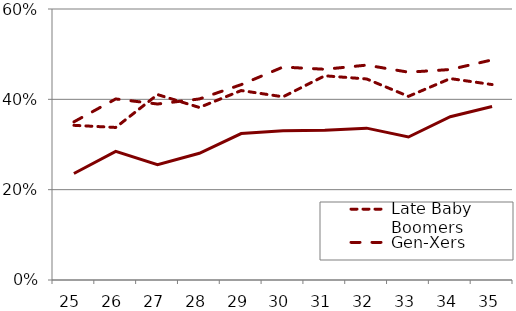
| Category | Late Baby Boomers | Gen-Xers | Millennials |
|---|---|---|---|
| 25.0 | 0.342 | 0.35 | 0.236 |
| 26.0 | 0.338 | 0.401 | 0.285 |
| 27.0 | 0.411 | 0.39 | 0.255 |
| 28.0 | 0.382 | 0.401 | 0.281 |
| 29.0 | 0.419 | 0.433 | 0.324 |
| 30.0 | 0.406 | 0.471 | 0.33 |
| 31.0 | 0.452 | 0.467 | 0.332 |
| 32.0 | 0.445 | 0.476 | 0.336 |
| 33.0 | 0.407 | 0.46 | 0.317 |
| 34.0 | 0.446 | 0.466 | 0.362 |
| 35.0 | 0.433 | 0.487 | 0.384 |